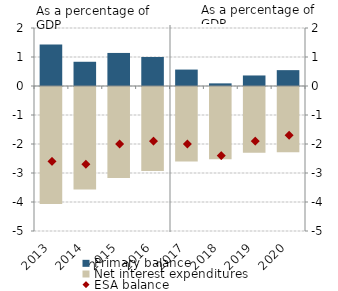
| Category | Primary balance |
|---|---|
| 2013.0 | 1.435 |
| 2014.0 | 0.836 |
| 2015.0 | 1.14 |
| 2016.0 | 1 |
| 2017.0 | 0.566 |
| 2018.0 | 0.091 |
| 2019.0 | 0.363 |
| 2020.0 | 0.547 |